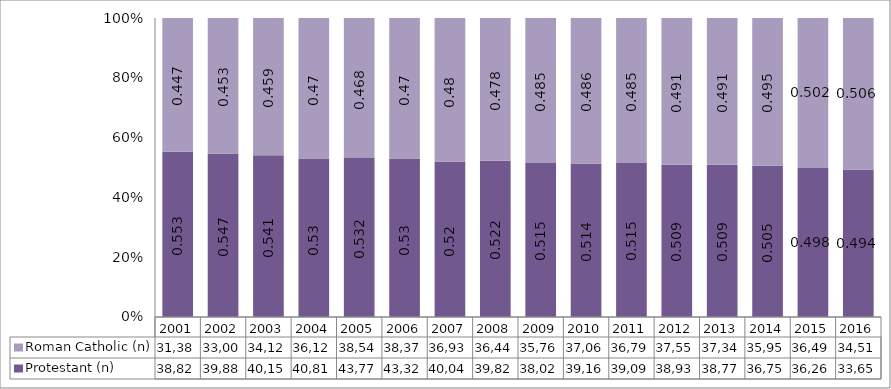
| Category | Protestant (n) | Roman Catholic (n) |
|---|---|---|
| 2001.0 | 38829 | 31387 |
| 2002.0 | 39880 | 33004 |
| 2003.0 | 40157 | 34124 |
| 2004.0 | 40811 | 36126 |
| 2005.0 | 43772 | 38546 |
| 2006.0 | 43329 | 38376 |
| 2007.0 | 40049 | 36933 |
| 2008.0 | 39828 | 36447 |
| 2009.0 | 38028 | 35766 |
| 2010.0 | 39164 | 37063 |
| 2011.0 | 39095 | 36793 |
| 2012.0 | 38930 | 37553 |
| 2013.0 | 38771 | 37344 |
| 2014.0 | 36753 | 35956 |
| 2015.0 | 36262 | 36490 |
| 2016.0 | 33654 | 34511 |